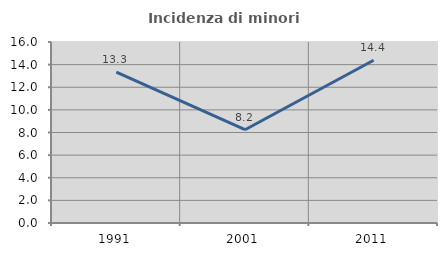
| Category | Incidenza di minori stranieri |
|---|---|
| 1991.0 | 13.333 |
| 2001.0 | 8.247 |
| 2011.0 | 14.382 |